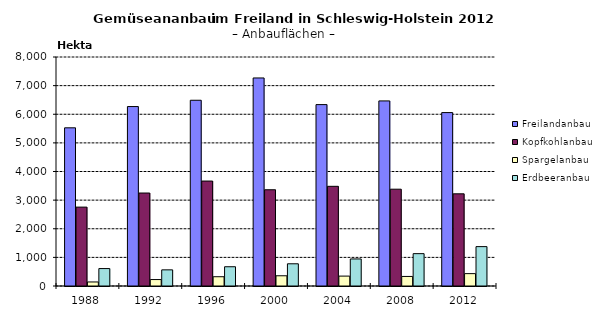
| Category | Freilandanbau | Kopfkohlanbau | Spargelanbau | Erdbeeranbau |
|---|---|---|---|---|
| 1988.0 | 5526 | 2756 | 141 | 609 |
| 1992.0 | 6269 | 3248 | 225 | 564 |
| 1996.0 | 6489 | 3666 | 324 | 673 |
| 2000.0 | 7268 | 3362 | 357 | 776 |
| 2004.0 | 6337 | 3482 | 346 | 945 |
| 2008.0 | 6466 | 3382 | 334 | 1130 |
| 2012.0 | 6058 | 3220 | 432 | 1376 |